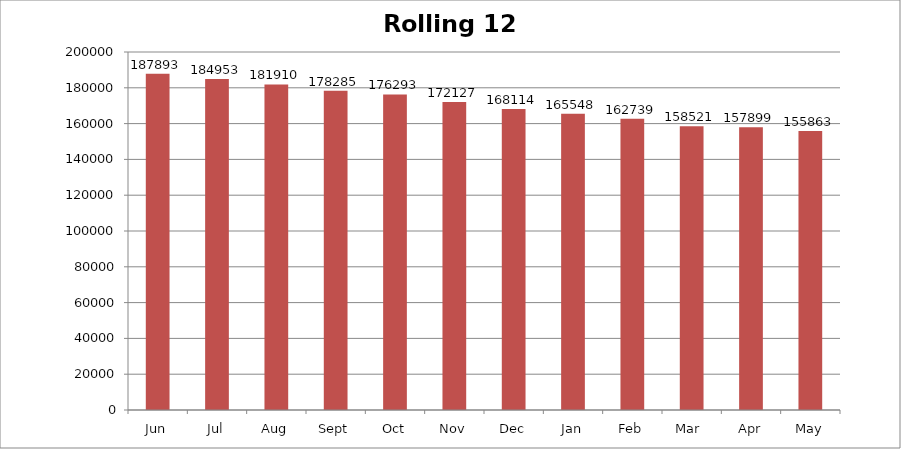
| Category | Rolling 12 Month |
|---|---|
| Jun | 187893 |
| Jul | 184953 |
| Aug | 181910 |
| Sept | 178285 |
| Oct | 176293 |
| Nov | 172127 |
| Dec | 168114 |
| Jan | 165548 |
| Feb | 162739 |
| Mar  | 158521 |
| Apr | 157899 |
| May | 155863 |